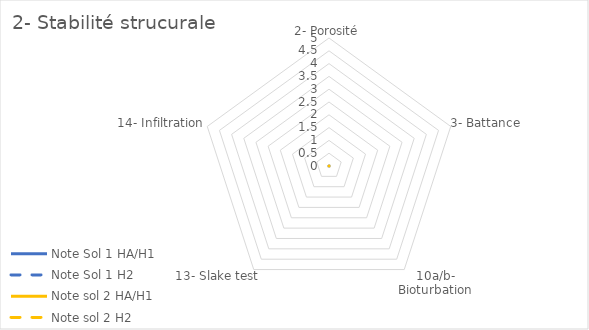
| Category | Note Sol 1 | Note sol 2 |
|---|---|---|
| 2- Porosité | 0 | 0 |
| 3- Battance | 0 | 0 |
| 10a/b- Bioturbation | 0 | 0 |
| 13- Slake test | 0 | 0 |
| 14- Infiltration | 0 | 0 |